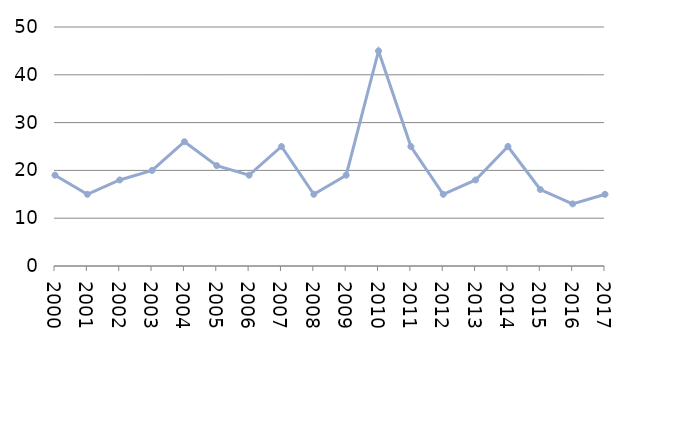
| Category | Avlidna |
|---|---|
| 2000 | 19 |
| 2001 | 15 |
| 2002 | 18 |
| 2003 | 20 |
| 2004 | 26 |
| 2005 | 21 |
| 2006 | 19 |
| 2007 | 25 |
| 2008 | 15 |
| 2009 | 19 |
| 2010 | 45 |
| 2011 | 25 |
| 2012 | 15 |
| 2013 | 18 |
| 2014 | 25 |
| 2015 | 16 |
| 2016 | 13 |
| 2017 | 15 |